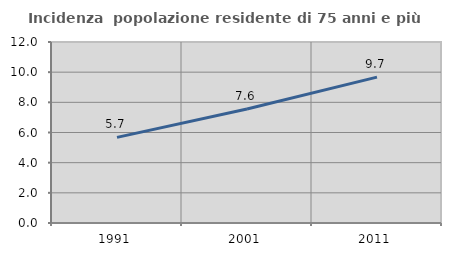
| Category | Incidenza  popolazione residente di 75 anni e più |
|---|---|
| 1991.0 | 5.675 |
| 2001.0 | 7.556 |
| 2011.0 | 9.672 |